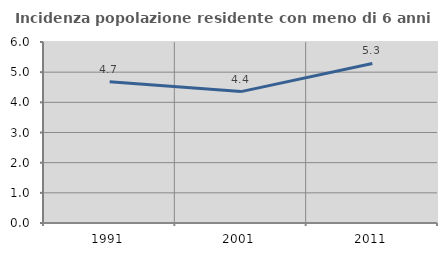
| Category | Incidenza popolazione residente con meno di 6 anni |
|---|---|
| 1991.0 | 4.679 |
| 2001.0 | 4.356 |
| 2011.0 | 5.288 |